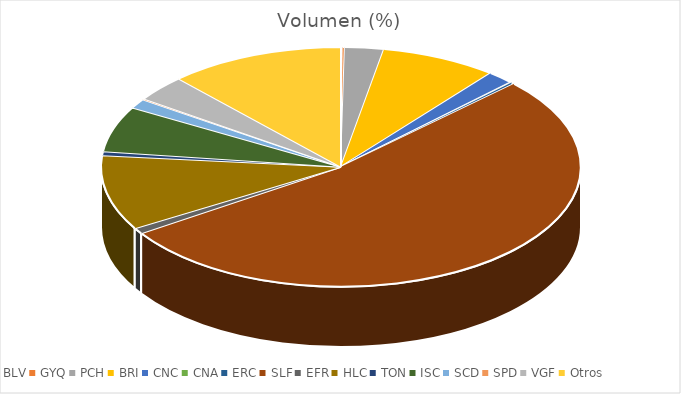
| Category | Volumen |
|---|---|
| BLV | 4850 |
| GYQ | 6674.02 |
| PCH | 119214.01 |
| BRI | 356000 |
| CNC | 81918.55 |
| CNA | 2460 |
| ERC | 11090 |
| SLF | 2398430.66 |
| EFR | 36090.6 |
| HLC | 457748.28 |
| TON | 24938.2 |
| ISC | 278907 |
| SCD | 58326.38 |
| SPD | 6050 |
| VGF | 160199 |
| Otros | 536893.55 |